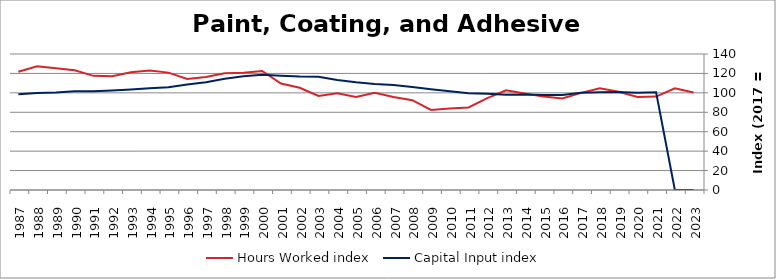
| Category | Hours Worked index | Capital Input index |
|---|---|---|
| 2023.0 | 100.409 | 0 |
| 2022.0 | 104.777 | 0 |
| 2021.0 | 96.205 | 100.617 |
| 2020.0 | 95.797 | 100.03 |
| 2019.0 | 101.103 | 100.934 |
| 2018.0 | 104.823 | 100.672 |
| 2017.0 | 100 | 100 |
| 2016.0 | 94.125 | 97.679 |
| 2015.0 | 96.127 | 97.811 |
| 2014.0 | 99.271 | 98.313 |
| 2013.0 | 102.67 | 98.084 |
| 2012.0 | 94.573 | 99.114 |
| 2011.0 | 85.042 | 99.684 |
| 2010.0 | 83.985 | 101.557 |
| 2009.0 | 82.409 | 103.829 |
| 2008.0 | 92.491 | 105.979 |
| 2007.0 | 95.756 | 108.056 |
| 2006.0 | 100.114 | 109.105 |
| 2005.0 | 95.731 | 110.827 |
| 2004.0 | 99.496 | 113.237 |
| 2003.0 | 96.814 | 116.615 |
| 2002.0 | 105.199 | 116.944 |
| 2001.0 | 109.549 | 117.716 |
| 2000.0 | 122.576 | 118.636 |
| 1999.0 | 120.586 | 117.044 |
| 1998.0 | 120.189 | 114.436 |
| 1997.0 | 116.35 | 111.018 |
| 1996.0 | 114.322 | 108.537 |
| 1995.0 | 120.83 | 105.781 |
| 1994.0 | 122.885 | 104.617 |
| 1993.0 | 121.246 | 103.408 |
| 1992.0 | 117.108 | 102.368 |
| 1991.0 | 117.514 | 101.635 |
| 1990.0 | 123.172 | 101.67 |
| 1989.0 | 125.253 | 100.49 |
| 1988.0 | 127.381 | 99.845 |
| 1987.0 | 121.708 | 98.593 |